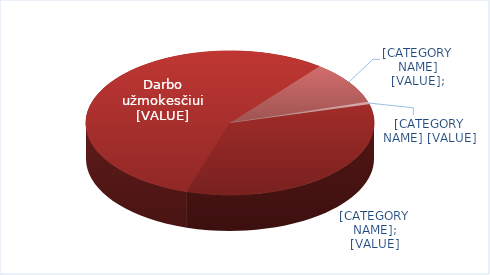
| Category | Series 0 | Series 1 |
|---|---|---|
| Kitos išlaidos |  | 0.34 |
| Darbo užmokesčiui |  | 0.558 |
| Dokumentams įsigyti |  | 0.096 |
| Automatizacija |  | 0.006 |